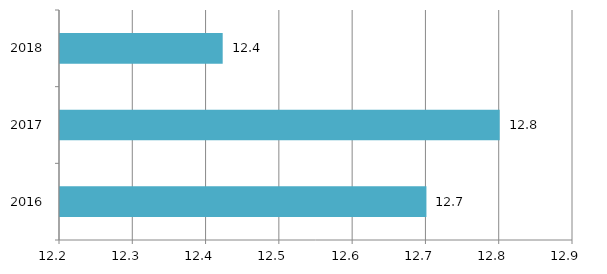
| Category | Series 0 |
|---|---|
| 2016.0 | 12.7 |
| 2017.0 | 12.8 |
| 2018.0 | 12.422 |